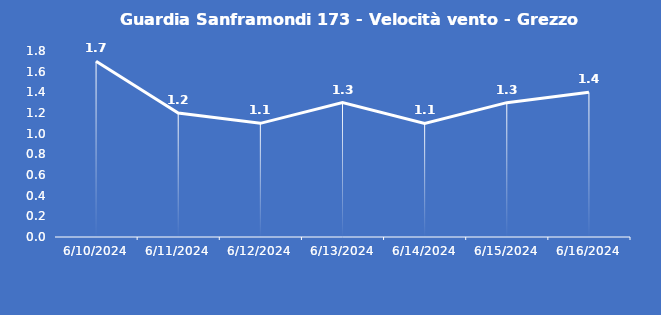
| Category | Guardia Sanframondi 173 - Velocità vento - Grezzo (m/s) |
|---|---|
| 6/10/24 | 1.7 |
| 6/11/24 | 1.2 |
| 6/12/24 | 1.1 |
| 6/13/24 | 1.3 |
| 6/14/24 | 1.1 |
| 6/15/24 | 1.3 |
| 6/16/24 | 1.4 |